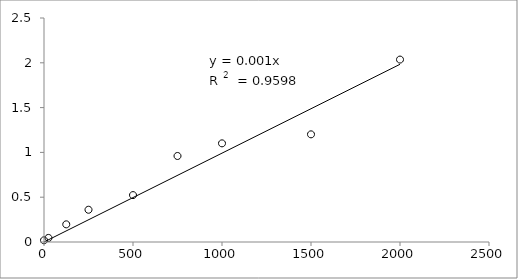
| Category | Series 0 |
|---|---|
| 2000.0 | 2.036 |
| 1500.0 | 1.202 |
| 1000.0 | 1.101 |
| 750.0 | 0.96 |
| 500.0 | 0.524 |
| 250.0 | 0.36 |
| 125.0 | 0.197 |
| 25.0 | 0.046 |
| 0.0 | 0.019 |